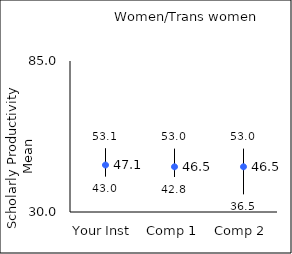
| Category | 25th percentile | 75th percentile | Mean |
|---|---|---|---|
| Your Inst | 43 | 53.1 | 47.11 |
| Comp 1 | 42.8 | 53 | 46.47 |
| Comp 2 | 36.5 | 53 | 46.48 |